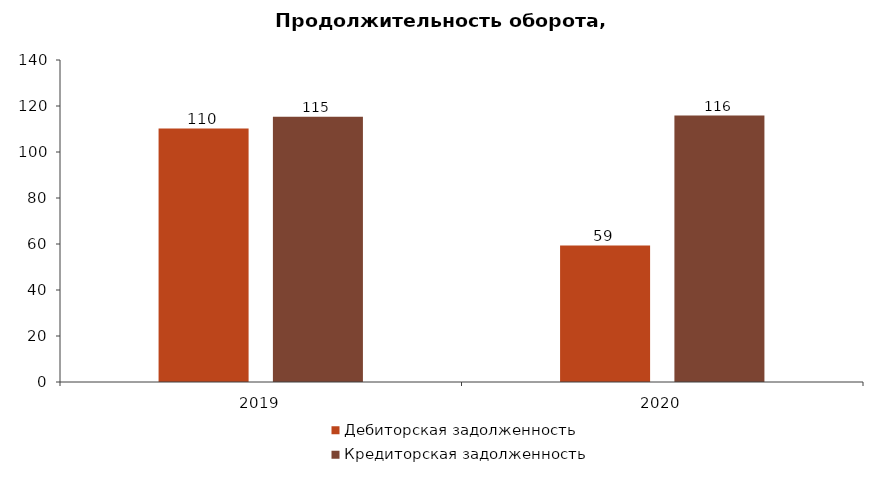
| Category | Дебиторская задолженность | Кредиторская задолженность |
|---|---|---|
| 2019.0 | 110.183 | 115.293 |
| 2020.0 | 59.345 | 115.831 |